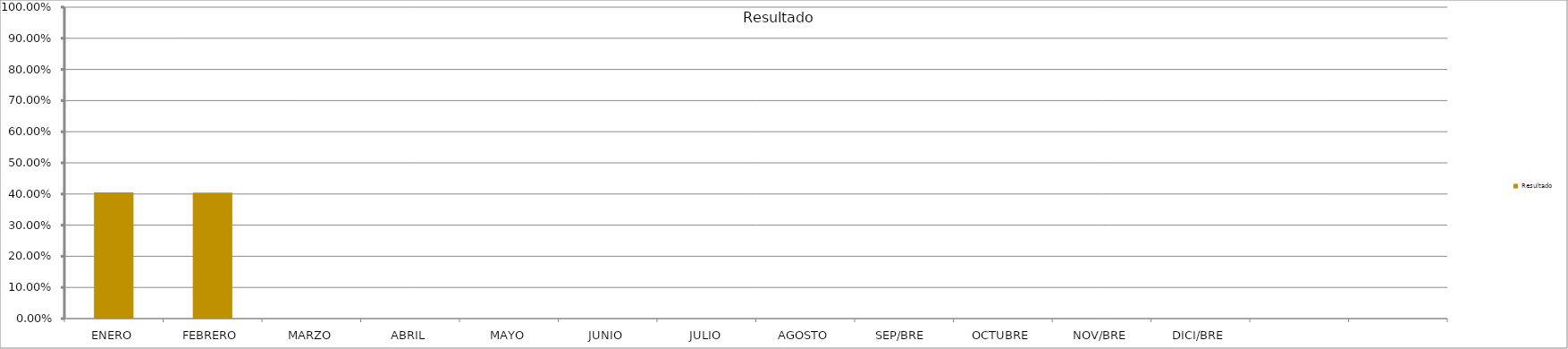
| Category | Resultado  |
|---|---|
| ENERO | 0.405 |
| FEBRERO | 0.405 |
| MARZO | 0 |
| ABRIL | 0 |
| MAYO | 0 |
| JUNIO | 0 |
| JULIO | 0 |
| AGOSTO | 0 |
| SEP/BRE  | 0 |
| OCTUBRE | 0 |
| NOV/BRE | 0 |
| DICI/BRE | 0 |